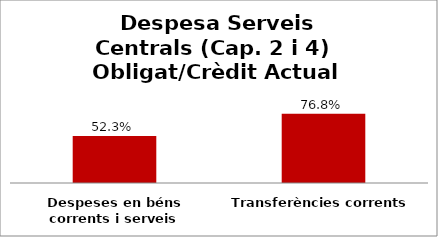
| Category | Series 0 |
|---|---|
| Despeses en béns corrents i serveis | 0.523 |
| Transferències corrents | 0.768 |